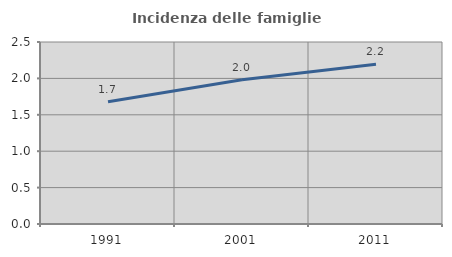
| Category | Incidenza delle famiglie numerose |
|---|---|
| 1991.0 | 1.679 |
| 2001.0 | 1.982 |
| 2011.0 | 2.193 |